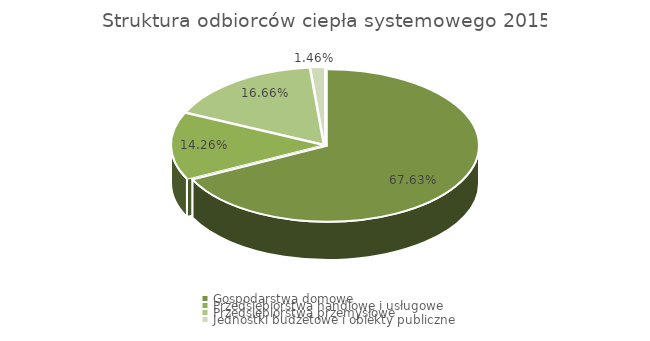
| Category | Series 0 |
|---|---|
| Gospodarstwa domowe | 0.676 |
| Przedsiębiorstwa handlowe i usługowe | 0.143 |
| Przedsiębiorstwa przemysłowe | 0.167 |
| Jednostki budżetowe i obiekty publiczne | 0.015 |